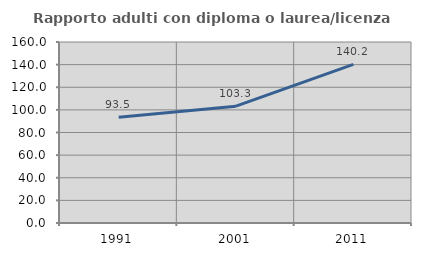
| Category | Rapporto adulti con diploma o laurea/licenza media  |
|---|---|
| 1991.0 | 93.532 |
| 2001.0 | 103.308 |
| 2011.0 | 140.16 |